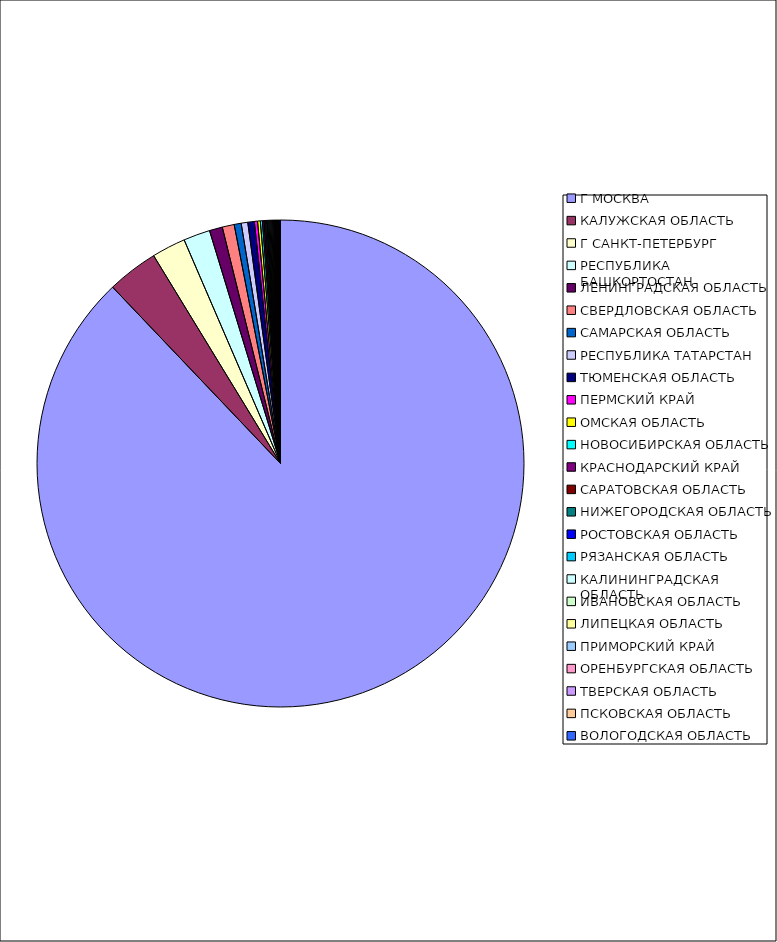
| Category | Оборот |
|---|---|
| Г МОСКВА | 0.879 |
| КАЛУЖСКАЯ ОБЛАСТЬ | 0.034 |
| Г САНКТ-ПЕТЕРБУРГ | 0.022 |
| РЕСПУБЛИКА БАШКОРТОСТАН | 0.018 |
| ЛЕНИНГРАДСКАЯ ОБЛАСТЬ | 0.009 |
| СВЕРДЛОВСКАЯ ОБЛАСТЬ | 0.008 |
| САМАРСКАЯ ОБЛАСТЬ | 0.005 |
| РЕСПУБЛИКА ТАТАРСТАН | 0.004 |
| ТЮМЕНСКАЯ ОБЛАСТЬ | 0.004 |
| ПЕРМСКИЙ КРАЙ | 0.002 |
| ОМСКАЯ ОБЛАСТЬ | 0.002 |
| НОВОСИБИРСКАЯ ОБЛАСТЬ | 0.001 |
| КРАСНОДАРСКИЙ КРАЙ | 0.001 |
| САРАТОВСКАЯ ОБЛАСТЬ | 0.001 |
| НИЖЕГОРОДСКАЯ ОБЛАСТЬ | 0.001 |
| РОСТОВСКАЯ ОБЛАСТЬ | 0.001 |
| РЯЗАНСКАЯ ОБЛАСТЬ | 0.001 |
| КАЛИНИНГРАДСКАЯ ОБЛАСТЬ | 0.001 |
| ИВАНОВСКАЯ ОБЛАСТЬ | 0.001 |
| ЛИПЕЦКАЯ ОБЛАСТЬ | 0.001 |
| ПРИМОРСКИЙ КРАЙ | 0.001 |
| ОРЕНБУРГСКАЯ ОБЛАСТЬ | 0.001 |
| ТВЕРСКАЯ ОБЛАСТЬ | 0 |
| ПСКОВСКАЯ ОБЛАСТЬ | 0 |
| ВОЛОГОДСКАЯ ОБЛАСТЬ | 0 |
| РЕСПУБЛИКА ДАГЕСТАН | 0 |
| РЕСПУБЛИКА МОРДОВИЯ | 0 |
| МОСКОВСКАЯ ОБЛАСТЬ | 0 |
| СТАВРОПОЛЬСКИЙ КРАЙ | 0 |
| УДМУРТСКАЯ РЕСПУБЛИКА | 0 |
| КАБАРДИНО-БАЛКАРСКАЯ РЕСПУБЛИКА | 0 |
| ИРКУТСКАЯ ОБЛАСТЬ | 0 |
| КИРОВСКАЯ ОБЛАСТЬ | 0 |
| РЕСПУБЛИКА СЕВЕРНАЯ ОСЕТИЯ-АЛАНИЯ | 0 |
| ВОРОНЕЖСКАЯ ОБЛАСТЬ | 0 |
| РЕСПУБЛИКА ХАКАСИЯ | 0 |
| ТУЛЬСКАЯ ОБЛАСТЬ | 0 |
| БЕЛГОРОДСКАЯ ОБЛАСТЬ | 0 |
| ЧЕЛЯБИНСКАЯ ОБЛАСТЬ | 0 |
| СМОЛЕНСКАЯ ОБЛАСТЬ | 0 |
| КУРСКАЯ ОБЛАСТЬ | 0 |
| РЕСПУБЛИКА КОМИ | 0 |
| КРАСНОЯРСКИЙ КРАЙ | 0 |
| АЛТАЙСКИЙ КРАЙ | 0 |
| КЕМЕРОВСКАЯ ОБЛАСТЬ | 0 |
| ЯРОСЛАВСКАЯ ОБЛАСТЬ | 0 |